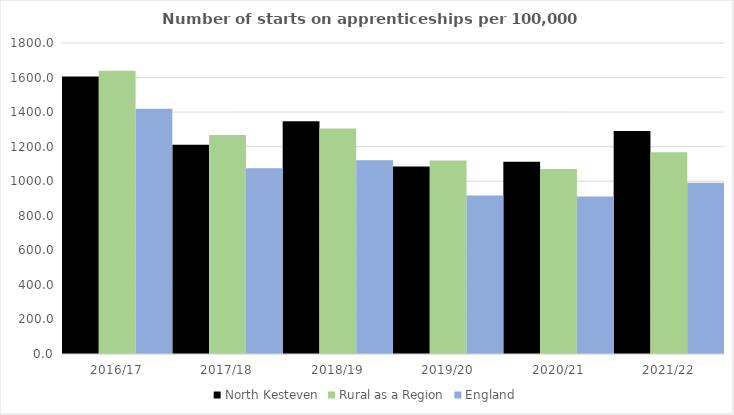
| Category | North Kesteven | Rural as a Region | England |
|---|---|---|---|
| 2016/17 | 1606 | 1638.789 | 1420 |
| 2017/18 | 1211 | 1267.474 | 1075 |
| 2018/19 | 1347 | 1304.57 | 1122 |
| 2019/20 | 1085 | 1119.662 | 918 |
| 2020/21 | 1113 | 1070.748 | 912 |
| 2021/22 | 1291 | 1167.68 | 991 |